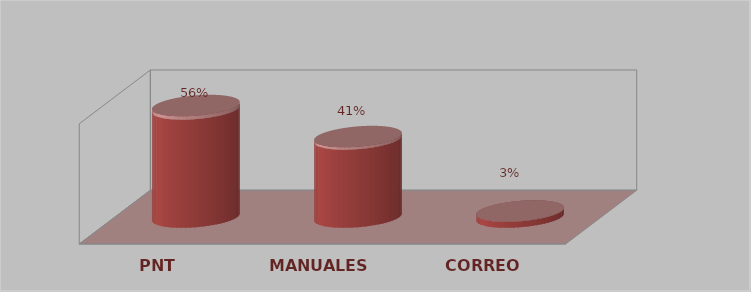
| Category | Series 0 | Series 1 |
|---|---|---|
| PNT | 18 | 0.562 |
| MANUALES | 13 | 0.406 |
| CORREO | 1 | 0.031 |